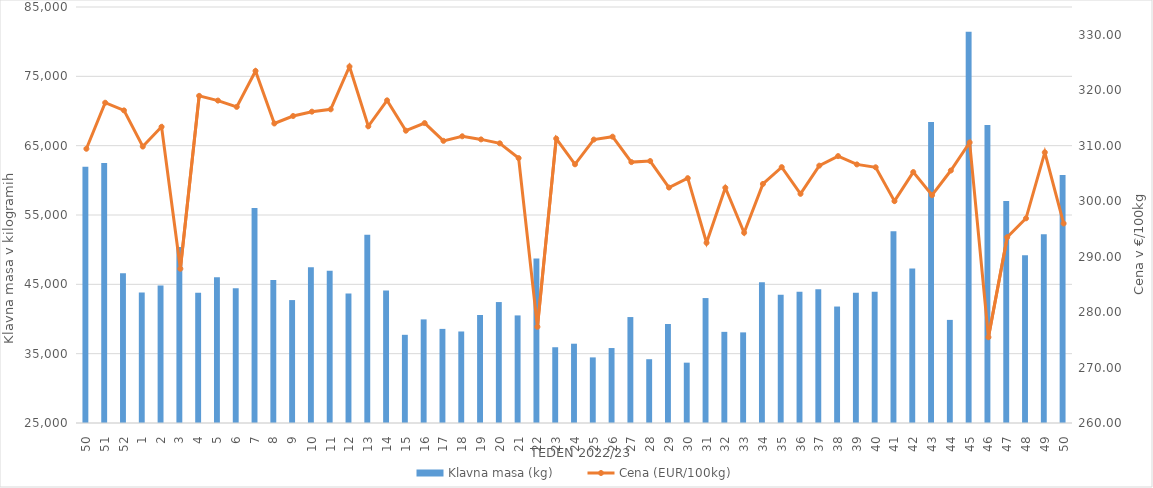
| Category | Klavna masa (kg) |
|---|---|
| 50.0 | 61942 |
| 51.0 | 62514 |
| 52.0 | 46589 |
| 1.0 | 43807 |
| 2.0 | 44834 |
| 3.0 | 50386 |
| 4.0 | 43773 |
| 5.0 | 46011 |
| 6.0 | 44439 |
| 7.0 | 56001 |
| 8.0 | 45613 |
| 9.0 | 42730 |
| 10.0 | 47471 |
| 11.0 | 46952 |
| 12.0 | 43683 |
| 13.0 | 52135 |
| 14.0 | 44103 |
| 15.0 | 37719 |
| 16.0 | 39943 |
| 17.0 | 38574 |
| 18.0 | 38200 |
| 19.0 | 40581 |
| 20.0 | 42443 |
| 21.0 | 40517 |
| 22.0 | 48742 |
| 23.0 | 35927 |
| 24.0 | 36436 |
| 25.0 | 34463 |
| 26.0 | 35812 |
| 27.0 | 40280 |
| 28.0 | 34201 |
| 29.0 | 39279 |
| 30.0 | 33702 |
| 31.0 | 43020 |
| 32.0 | 38146 |
| 33.0 | 38070 |
| 34.0 | 45290 |
| 35.0 | 43513 |
| 36.0 | 43945 |
| 37.0 | 44302 |
| 38.0 | 41798 |
| 39.0 | 43790 |
| 40.0 | 43913 |
| 41.0 | 52663 |
| 42.0 | 47275 |
| 43.0 | 68419 |
| 44.0 | 39872 |
| 45.0 | 81439 |
| 46.0 | 67983 |
| 47.0 | 57006 |
| 48.0 | 49204 |
| 49.0 | 52219 |
| 50.0 | 60759 |